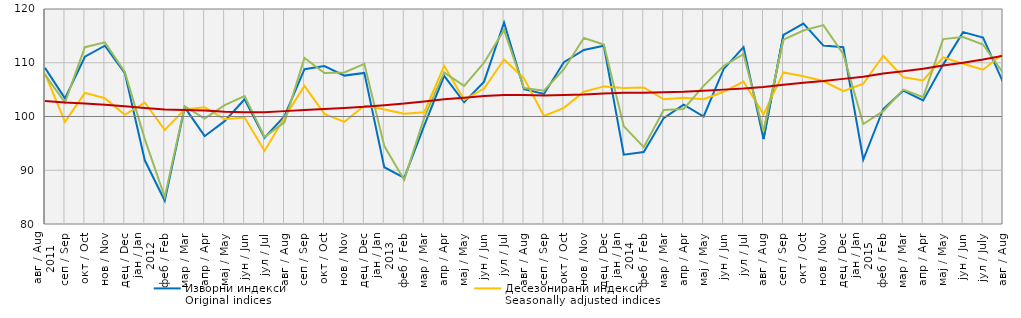
| Category | Изворни индекси
Original indices | Десезонирани индекси
Seasonally adjusted indices | Календарски прилагођени индекси
Working-day adjusted indices | Тренд
Trend |
|---|---|---|---|---|
| 0 | 109.048 | 108 | 107.8 | 102.9 |
| 1 | 103.369 | 99 | 102.6 | 102.6 |
| 2 | 111.125 | 104.4 | 112.9 | 102.4 |
| 3 | 113.167 | 103.4 | 113.8 | 102.2 |
| 4 | 108.083 | 100.3 | 108.3 | 101.9 |
| 5 | 91.849 | 102.6 | 95.8 | 101.6 |
| 6 | 84.325 | 97.5 | 85 | 101.3 |
| 7 | 101.706 | 101.3 | 101.9 | 101.2 |
| 8 | 96.339 | 101.7 | 99.6 | 101.1 |
| 9 | 99.133 | 99.5 | 102.1 | 100.9 |
| 10 | 103.214 | 99.8 | 103.8 | 100.8 |
| 11 | 96.046 | 93.6 | 96.2 | 100.8 |
| 12 | 100.071 | 99.8 | 98.9 | 101 |
| 13 | 108.809 | 105.7 | 110.9 | 101.2 |
| 14 | 109.371 | 100.5 | 108.1 | 101.4 |
| 15 | 107.609 | 99 | 108.2 | 101.6 |
| 16 | 108.112 | 102 | 109.8 | 101.8 |
| 17 | 90.559 | 101.3 | 94.5 | 102.1 |
| 18 | 88.596 | 100.5 | 88.2 | 102.4 |
| 19 | 98.288 | 100.8 | 99.8 | 102.8 |
| 20 | 107.567 | 109.4 | 108.2 | 103.2 |
| 21 | 102.635 | 103.1 | 105.7 | 103.5 |
| 22 | 106.478 | 105.2 | 110 | 103.8 |
| 23 | 117.488 | 110.6 | 116.1 | 104 |
| 24 | 105.073 | 107.1 | 105.3 | 104 |
| 25 | 104.198 | 100.1 | 104.8 | 103.9 |
| 26 | 110.096 | 101.6 | 108.8 | 104 |
| 27 | 112.368 | 104.6 | 114.6 | 104.1 |
| 28 | 113.169 | 105.6 | 113.4 | 104.3 |
| 29 | 92.9 | 105.3 | 98.2 | 104.4 |
| 30 | 93.4 | 105.4 | 94.3 | 104.4 |
| 31 | 99.7 | 103.2 | 101.2 | 104.5 |
| 32 | 102.2 | 103.5 | 101.4 | 104.6 |
| 33 | 100 | 103.2 | 105.7 | 104.8 |
| 34 | 108.8 | 104.6 | 109.4 | 105 |
| 35 | 112.9 | 106.5 | 111.6 | 105.2 |
| 36 | 95.8 | 100.4 | 97.3 | 105.5 |
| 37 | 115.2 | 108.2 | 114.3 | 105.9 |
| 38 | 117.3 | 107.5 | 116 | 106.3 |
| 39 | 113.2 | 106.6 | 117 | 106.6 |
| 40 | 112.9 | 104.7 | 111.6 | 107 |
| 41 | 92 | 106.1 | 98.6 | 107.4 |
| 42 | 101.4 | 111.3 | 101 | 108 |
| 43 | 104.8 | 107.3 | 105 | 108.4 |
| 44 | 103 | 106.7 | 103.6 | 108.9 |
| 45 | 109.651 | 111 | 114.4 | 109.5 |
| 46 | 115.698 | 109.8 | 114.8 | 110 |
| 47 | 114.7 | 108.7 | 113.4 | 110.6 |
| 48 | 106.4 | 111.7 | 108.1 | 111.3 |